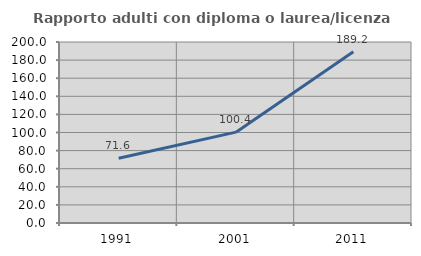
| Category | Rapporto adulti con diploma o laurea/licenza media  |
|---|---|
| 1991.0 | 71.556 |
| 2001.0 | 100.38 |
| 2011.0 | 189.212 |